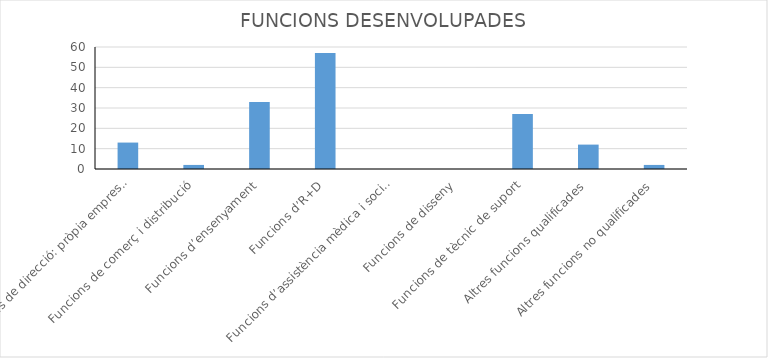
| Category | Series 0 |
|---|---|
| Funcions de direcció: pròpia empresa, direcció, producció, financera, etc. | 13 |
| Funcions de comerç i distribució | 2 |
| Funcions d’ensenyament | 33 |
| Funcions d’R+D | 57 |
| Funcions d’assistència mèdica i social | 0 |
| Funcions de disseny | 0 |
| Funcions de tècnic de suport | 27 |
| Altres funcions qualificades | 12 |
| Altres funcions no qualificades | 2 |